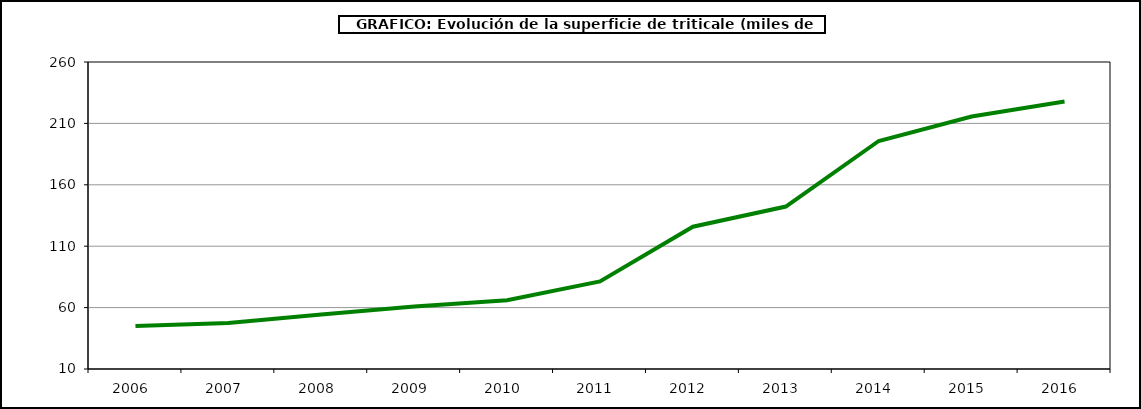
| Category | Superficie |
|---|---|
| 2006.0 | 45.044 |
| 2007.0 | 47.411 |
| 2008.0 | 54.394 |
| 2009.0 | 60.987 |
| 2010.0 | 65.984 |
| 2011.0 | 81.322 |
| 2012.0 | 125.879 |
| 2013.0 | 142.31 |
| 2014.0 | 195.684 |
| 2015.0 | 215.62 |
| 2016.0 | 227.792 |